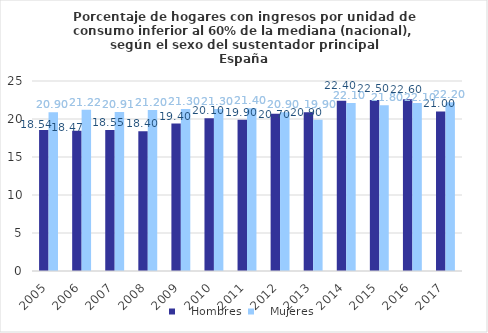
| Category |    Hombres |    Mujeres |
|---|---|---|
| 2005.0 | 18.54 | 20.901 |
| 2006.0 | 18.468 | 21.216 |
| 2007.0 | 18.551 | 20.915 |
| 2008.0 | 18.4 | 21.2 |
| 2009.0 | 19.4 | 21.3 |
| 2010.0 | 20.1 | 21.3 |
| 2011.0 | 19.9 | 21.4 |
| 2012.0 | 20.7 | 20.9 |
| 2013.0 | 20.9 | 19.9 |
| 2014.0 | 22.4 | 22.1 |
| 2015.0 | 22.5 | 21.8 |
| 2016.0 | 22.6 | 22.1 |
| 2017.0 | 21 | 22.2 |